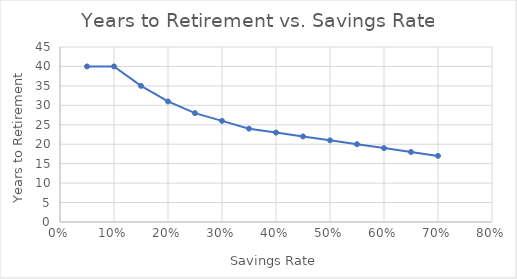
| Category | Series 0 |
|---|---|
| 0.05 | 40 |
| 0.1 | 40 |
| 0.15 | 35 |
| 0.2 | 31 |
| 0.25 | 28 |
| 0.3 | 26 |
| 0.35 | 24 |
| 0.4 | 23 |
| 0.45 | 22 |
| 0.5 | 21 |
| 0.55 | 20 |
| 0.6 | 19 |
| 0.65 | 18 |
| 0.7 | 17 |